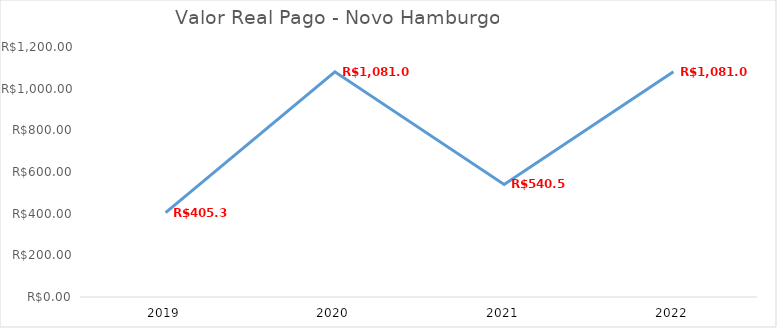
| Category | Series 0 |
|---|---|
| 2019.0 | 405.39 |
| 2020.0 | 1081.04 |
| 2021.0 | 540.52 |
| 2022.0 | 1081.04 |